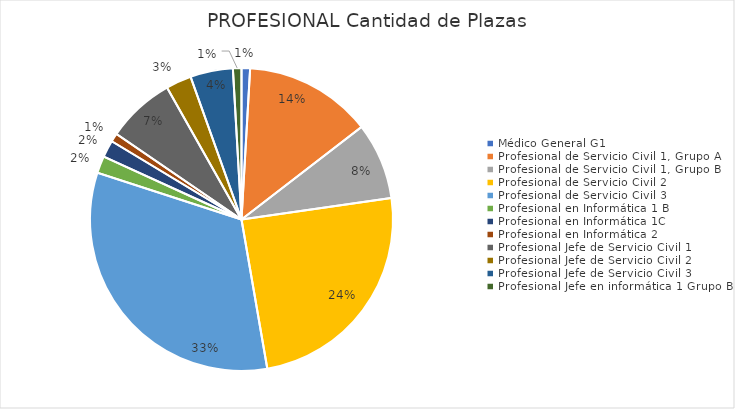
| Category | PROFESIONAL |
|---|---|
| Médico General G1 | 1 |
| Profesional de Servicio Civil 1, Grupo A | 15 |
| Profesional de Servicio Civil 1, Grupo B | 9 |
| Profesional de Servicio Civil 2 | 27 |
| Profesional de Servicio Civil 3 | 36 |
| Profesional en Informática 1 B | 2 |
| Profesional en Informática 1C | 2 |
| Profesional en Informática 2 | 1 |
| Profesional Jefe de Servicio Civil 1 | 8 |
| Profesional Jefe de Servicio Civil 2 | 3 |
| Profesional Jefe de Servicio Civil 3 | 5 |
| Profesional Jefe en informática 1 Grupo B | 1 |